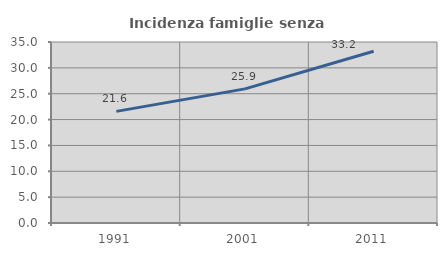
| Category | Incidenza famiglie senza nuclei |
|---|---|
| 1991.0 | 21.586 |
| 2001.0 | 25.933 |
| 2011.0 | 33.209 |